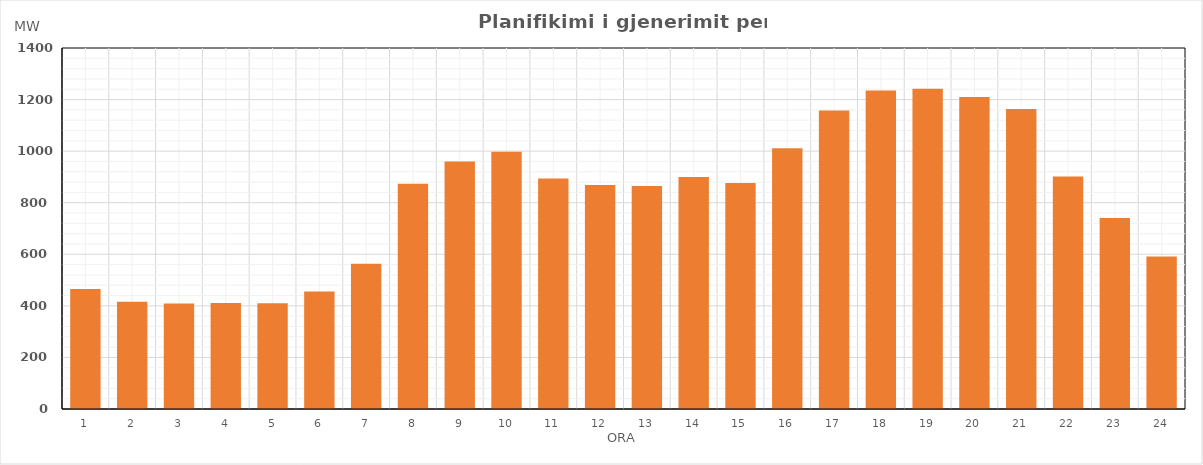
| Category | Max (MW) |
|---|---|
| 0 | 465.65 |
| 1 | 416.3 |
| 2 | 409.3 |
| 3 | 411 |
| 4 | 410.3 |
| 5 | 455.52 |
| 6 | 563.48 |
| 7 | 873.82 |
| 8 | 959.49 |
| 9 | 998.09 |
| 10 | 894.17 |
| 11 | 869.09 |
| 12 | 864.7 |
| 13 | 899.33 |
| 14 | 876.05 |
| 15 | 1011.3 |
| 16 | 1157.97 |
| 17 | 1235.52 |
| 18 | 1242.26 |
| 19 | 1210.35 |
| 20 | 1163.7 |
| 21 | 901.73 |
| 22 | 740.96 |
| 23 | 591.62 |